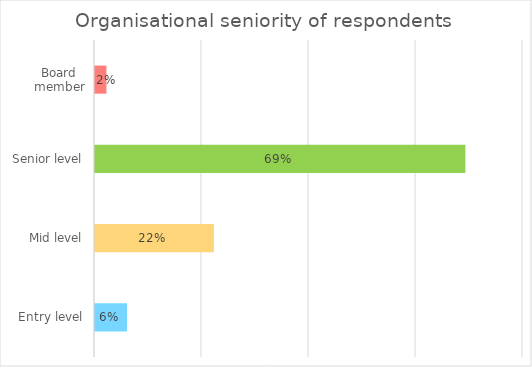
| Category | % |
|---|---|
| Board member | 2.137 |
| Senior level | 69.231 |
| Mid level | 22.222 |
| Entry level | 5.983 |